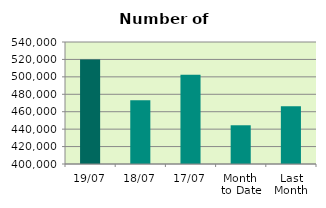
| Category | Series 0 |
|---|---|
| 19/07 | 520016 |
| 18/07 | 473098 |
| 17/07 | 502276 |
| Month 
to Date | 444445.2 |
| Last
Month | 466167.6 |